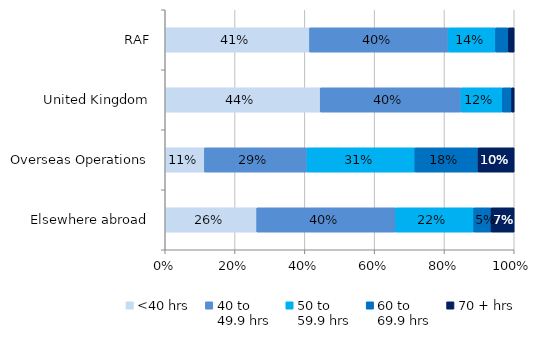
| Category | <40 hrs | 40 to 
49.9 hrs | 50 to 
59.9 hrs | 60 to 
69.9 hrs | 70 + hrs |
|---|---|---|---|---|---|
| RAF | 0.414 | 0.397 | 0.136 | 0.037 | 0.017 |
| United Kingdom | 0.444 | 0.403 | 0.119 | 0.026 | 0.007 |
| Overseas Operations | 0.112 | 0.294 | 0.309 | 0.181 | 0.104 |
| Elsewhere abroad | 0.262 | 0.398 | 0.224 | 0.05 | 0.066 |